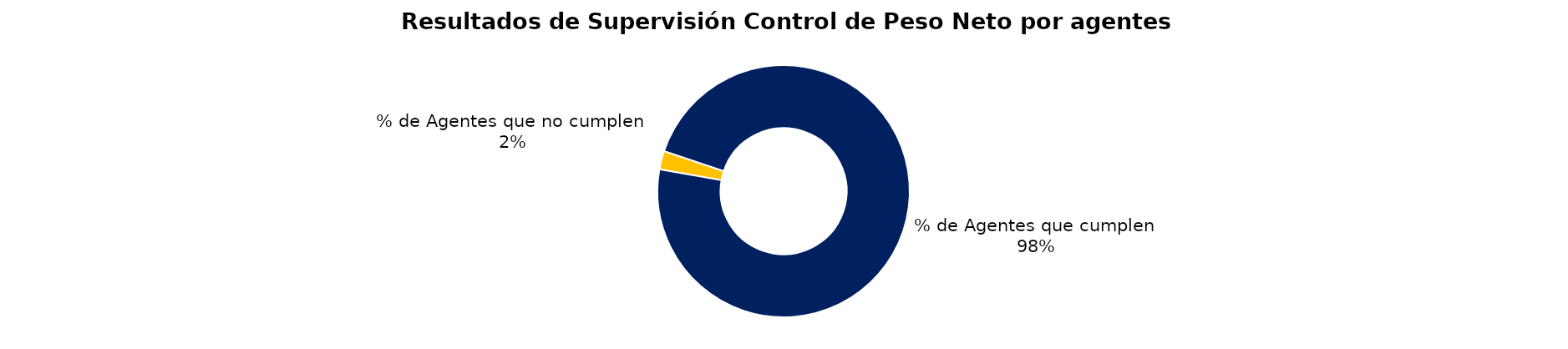
| Category | Series 0 |
|---|---|
| % de Agentes que no cumplen | 1 |
| % de Agentes que cumplen | 41 |